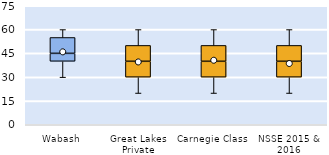
| Category | 25th | 50th | 75th |
|---|---|---|---|
| Wabash | 40 | 5 | 10 |
| Great Lakes Private | 30 | 10 | 10 |
| Carnegie Class | 30 | 10 | 10 |
| NSSE 2015 & 2016 | 30 | 10 | 10 |